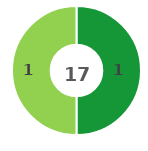
| Category | Series 0 |
|---|---|
| 0 | 1 |
| 1 | 1 |
| 2 | 0 |
| 3 | 0 |
| 4 | 0 |